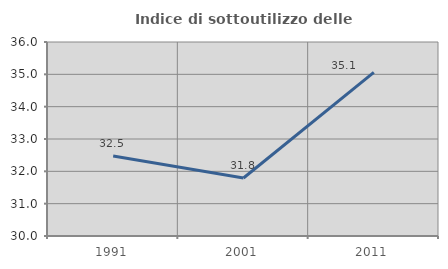
| Category | Indice di sottoutilizzo delle abitazioni  |
|---|---|
| 1991.0 | 32.476 |
| 2001.0 | 31.793 |
| 2011.0 | 35.062 |